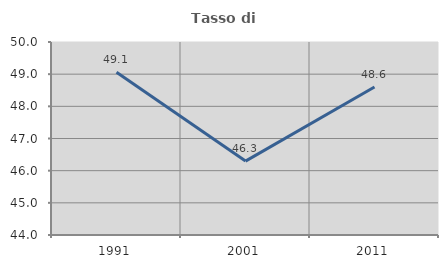
| Category | Tasso di occupazione   |
|---|---|
| 1991.0 | 49.06 |
| 2001.0 | 46.298 |
| 2011.0 | 48.6 |